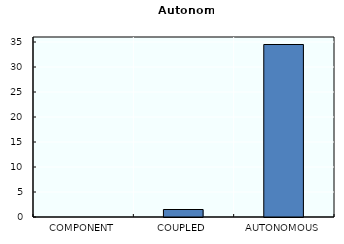
| Category | Autonomy |
|---|---|
| COMPONENT | 0 |
| COUPLED | 1.5 |
| AUTONOMOUS | 34.5 |